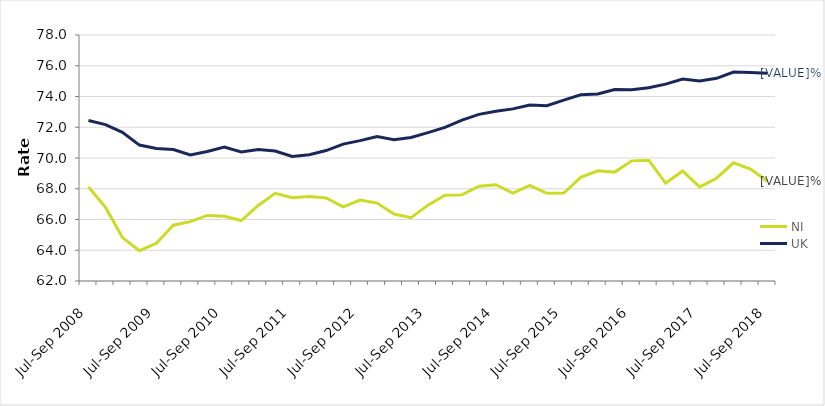
| Category | NI | UK |
|---|---|---|
| Jul-Sep 2008 | 68.114 | 72.436 |
| Oct-Dec 2008 | 66.798 | 72.174 |
| Jan-Mar 2009 | 64.822 | 71.673 |
| Apr-Jun 2009 | 63.973 | 70.84 |
| Jul-Sep 2009 | 64.453 | 70.617 |
| Oct-Dec 2009 | 65.629 | 70.552 |
| Jan-Mar 2010 | 65.858 | 70.195 |
| Apr-Jun 2010 | 66.264 | 70.423 |
| Jul-Sep 2010 | 66.205 | 70.705 |
| Oct-Dec 2010 | 65.931 | 70.39 |
| Jan-Mar 2011 | 66.913 | 70.546 |
| Apr-Jun 2011 | 67.699 | 70.45 |
| Jul-Sep 2011 | 67.411 | 70.095 |
| Oct-Dec 2011 | 67.496 | 70.211 |
| Jan-Mar 2012 | 67.397 | 70.483 |
| Apr-Jun 2012 | 66.82 | 70.901 |
| Jul-Sep 2012 | 67.268 | 71.128 |
| Oct-Dec 2012 | 67.066 | 71.399 |
| Jan-Mar 2013 | 66.353 | 71.182 |
| Apr-Jun 2013 | 66.116 | 71.333 |
| Jul-Sep 2013 | 66.933 | 71.651 |
| Oct-Dec 2013 | 67.579 | 71.99 |
| Jan-Mar 2014 | 67.602 | 72.466 |
| Apr-Jun 2014 | 68.162 | 72.836 |
| Jul-Sep 2014 | 68.262 | 73.036 |
| Oct-Dec 2014 | 67.714 | 73.196 |
| Jan-Mar 2015 | 68.214 | 73.449 |
| Apr-Jun 2015 | 67.708 | 73.396 |
| Jul-Sep 2015 | 67.717 | 73.762 |
| Oct-Dec 2015 | 68.739 | 74.112 |
| Jan-Mar 2016 | 69.166 | 74.163 |
| Apr-Jun 2016 | 69.083 | 74.45 |
| Jul-Sep 2016 | 69.813 | 74.433 |
| Oct-Dec 2016 | 69.856 | 74.568 |
| Jan-Mar 2017 | 68.362 | 74.803 |
| Apr-Jun 2017 | 69.155 | 75.132 |
| Jul-Sep 2017 | 68.122 | 75.012 |
| Oct-Dec 2017 | 68.685 | 75.18 |
| Jan-Mar 2018 | 69.69 | 75.586 |
| Apr-Jun 2018 | 69.28 | 75.559 |
| Jul-Sep 2018 | 68.483 | 75.512 |